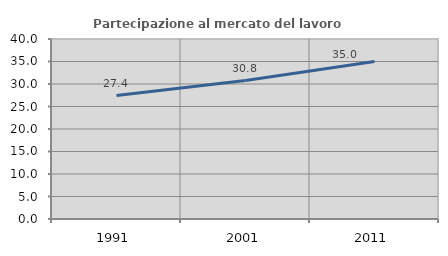
| Category | Partecipazione al mercato del lavoro  femminile |
|---|---|
| 1991.0 | 27.435 |
| 2001.0 | 30.769 |
| 2011.0 | 34.998 |